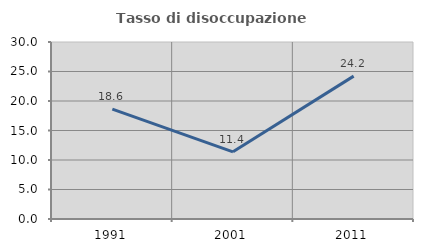
| Category | Tasso di disoccupazione giovanile  |
|---|---|
| 1991.0 | 18.627 |
| 2001.0 | 11.382 |
| 2011.0 | 24.219 |